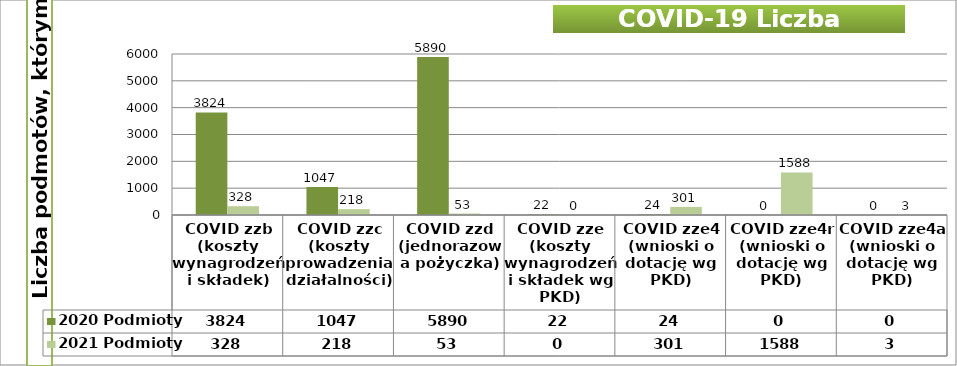
| Category | 2020 Podmioty | 2021 Podmioty |
|---|---|---|
| COVID zzb (koszty wynagrodzeń i składek) | 3824 | 328 |
| COVID zzc (koszty prowadzenia działalności) | 1047 | 218 |
| COVID zzd (jednorazowa pożyczka) | 5890 | 53 |
| COVID zze (koszty wynagrodzeń i składek wg PKD) | 22 | 0 |
| COVID zze4 (wnioski o dotację wg PKD) | 24 | 301 |
| COVID zze4r (wnioski o dotację wg PKD) | 0 | 1588 |
| COVID zze4a (wnioski o dotację wg PKD) | 0 | 3 |